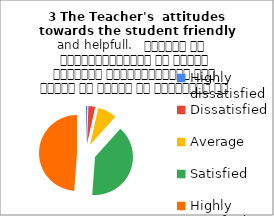
| Category | 3 The Teacher's  attitudes towards the student friendly and helpfull.   शिक्षक का विद्यार्थियों के प्रति व्यवहार मित्रतापूर्ण एवम सहयोग के भावना से परिपूर्ण था |
|---|---|
| Highly dissatisfied | 1 |
| Dissatisfied | 5 |
| Average | 14 |
| Satisfied | 68 |
| Highly satisfied | 84 |